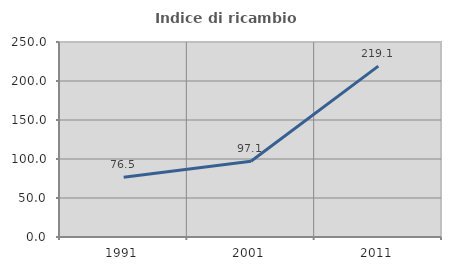
| Category | Indice di ricambio occupazionale  |
|---|---|
| 1991.0 | 76.471 |
| 2001.0 | 97.08 |
| 2011.0 | 219.113 |